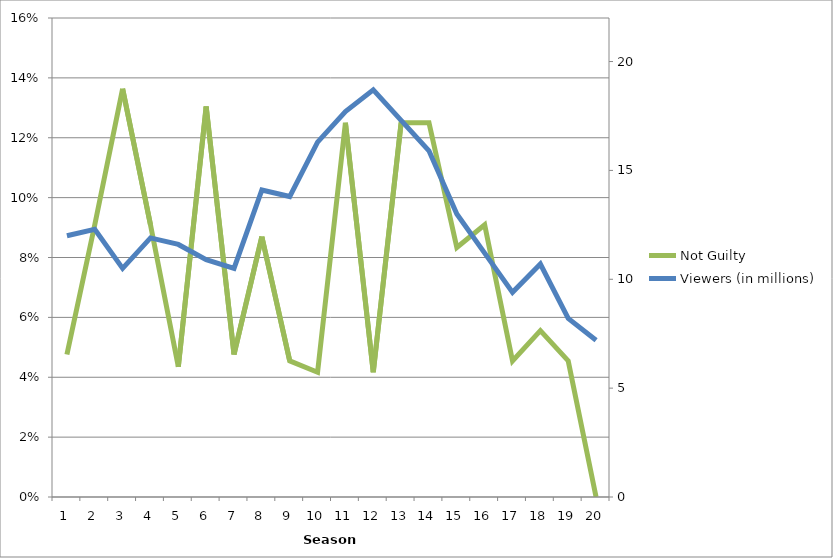
| Category | Not Guilty |
|---|---|
| 0 | 0.048 |
| 1 | 0.091 |
| 2 | 0.136 |
| 3 | 0.091 |
| 4 | 0.043 |
| 5 | 0.13 |
| 6 | 0.048 |
| 7 | 0.087 |
| 8 | 0.045 |
| 9 | 0.042 |
| 10 | 0.125 |
| 11 | 0.042 |
| 12 | 0.125 |
| 13 | 0.125 |
| 14 | 0.083 |
| 15 | 0.091 |
| 16 | 0.045 |
| 17 | 0.056 |
| 18 | 0.045 |
| 19 | 0 |